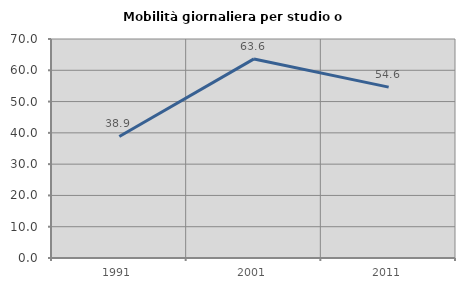
| Category | Mobilità giornaliera per studio o lavoro |
|---|---|
| 1991.0 | 38.851 |
| 2001.0 | 63.636 |
| 2011.0 | 54.622 |